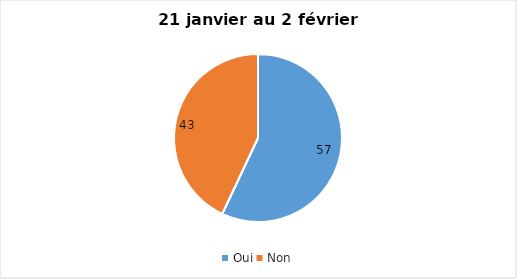
| Category | 21 janvier au 2 février 2022 |
|---|---|
| Oui | 57 |
| Non | 43 |